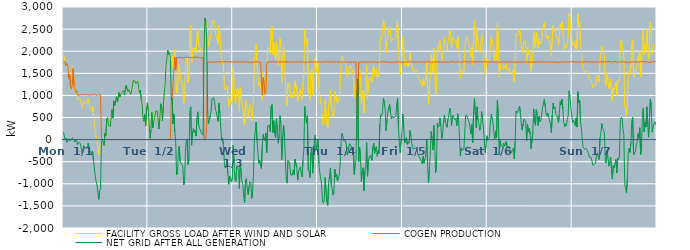
| Category | FACILITY GROSS LOAD AFTER WIND AND SOLAR | COGEN PRODUCTION | NET GRID AFTER ALL GENERATION |
|---|---|---|---|
|  Mon  1/1 | 1920 | 1759 | 161 |
|  Mon  1/1 | 1850 | 1761 | 89 |
|  Mon  1/1 | 1764 | 1761 | 3 |
|  Mon  1/1 | 1705 | 1670 | 35 |
|  Mon  1/1 | 1656 | 1719 | -63 |
|  Mon  1/1 | 1601 | 1651 | -50 |
|  Mon  1/1 | 1404 | 1382 | 22 |
|  Mon  1/1 | 1454 | 1482 | -28 |
|  Mon  1/1 | 1142 | 1192 | -50 |
|  Mon  1/1 | 1148 | 1142 | 6 |
|  Mon  1/1 | 1280 | 1239 | 41 |
|  Mon  1/1 | 1650 | 1610 | 40 |
|  Mon  1/1 | 1210 | 1207 | 3 |
|  Mon  1/1 | 1090 | 1144 | -54 |
|  Mon  1/1 | 1079 | 1065 | 14 |
|  Mon  1/1 | 1090 | 1102 | -12 |
|  Mon  1/1 | 893 | 1006 | -113 |
|  Mon  1/1 | 885 | 1011 | -126 |
|  Mon  1/1 | 942 | 1004 | -62 |
|  Mon  1/1 | 911 | 1004 | -93 |
|  Mon  1/1 | 848 | 1017 | -169 |
|  Mon  1/1 | 722 | 1019 | -297 |
|  Mon  1/1 | 771 | 1011 | -240 |
|  Mon  1/1 | 876 | 1012 | -136 |
|  Mon  1/1 | 874 | 1012 | -138 |
|  Mon  1/1 | 808 | 1005 | -197 |
|  Mon  1/1 | 809 | 1016 | -207 |
|  Mon  1/1 | 825 | 1019 | -194 |
|  Mon  1/1 | 928 | 1007 | -79 |
|  Mon  1/1 | 835 | 1017 | -182 |
|  Mon  1/1 | 722 | 1014 | -292 |
|  Mon  1/1 | 739 | 1004 | -265 |
|  Mon  1/1 | 667 | 1005 | -338 |
|  Mon  1/1 | 746 | 1012 | -266 |
|  Mon  1/1 | 543 | 1015 | -472 |
|  Mon  1/1 | 527 | 1000 | -473 |
|  Mon  1/1 | 190 | 1014 | -824 |
|  Mon  1/1 | 55 | 1006 | -951 |
|  Mon  1/1 | -31 | 1000 | -1031 |
|  Mon  1/1 | -34 | 1008 | -1042 |
|  Mon  1/1 | -337 | 1015 | -1352 |
|  Mon  1/1 | -141 | 1018 | -1159 |
|  Mon  1/1 | -101 | 1015 | -1116 |
|  Mon  1/1 | -77 | 0 | -77 |
|  Mon  1/1 | 2 | 0 | 2 |
|  Mon  1/1 | 8 | 0 | 8 |
|  Mon  1/1 | -132 | 0 | -132 |
|  Mon  1/1 | 142 | 0 | 142 |
|  Mon  1/1 | 87 | 0 | 87 |
|  Mon  1/1 | 474 | 0 | 474 |
|  Mon  1/1 | 502 | 0 | 502 |
|  Mon  1/1 | 321 | 0 | 321 |
|  Mon  1/1 | 328 | 0 | 328 |
|  Mon  1/1 | 293 | 0 | 293 |
|  Mon  1/1 | 511 | 0 | 511 |
|  Mon  1/1 | 682 | 0 | 682 |
|  Mon  1/1 | 487 | 0 | 487 |
|  Mon  1/1 | 876 | 0 | 876 |
|  Mon  1/1 | 771 | 0 | 771 |
|  Mon  1/1 | 872 | 0 | 872 |
|  Mon  1/1 | 971 | 0 | 971 |
|  Mon  1/1 | 854 | 0 | 854 |
|  Mon  1/1 | 856 | 0 | 856 |
|  Mon  1/1 | 1066 | 0 | 1066 |
|  Mon  1/1 | 966 | 0 | 966 |
|  Mon  1/1 | 974 | 0 | 974 |
|  Mon  1/1 | 1064 | 0 | 1064 |
|  Mon  1/1 | 1073 | 0 | 1073 |
|  Mon  1/1 | 1115 | 0 | 1115 |
|  Mon  1/1 | 1007 | 0 | 1007 |
|  Mon  1/1 | 1029 | 0 | 1029 |
|  Mon  1/1 | 1224 | 0 | 1224 |
|  Mon  1/1 | 1139 | 0 | 1139 |
|  Mon  1/1 | 1089 | 0 | 1089 |
|  Mon  1/1 | 1135 | 0 | 1135 |
|  Mon  1/1 | 1115 | 0 | 1115 |
|  Mon  1/1 | 1025 | 0 | 1025 |
|  Mon  1/1 | 1078 | 0 | 1078 |
|  Mon  1/1 | 1213 | 0 | 1213 |
|  Mon  1/1 | 1345 | 0 | 1345 |
|  Mon  1/1 | 1341 | 0 | 1341 |
|  Mon  1/1 | 1322 | 0 | 1322 |
|  Mon  1/1 | 1270 | 0 | 1270 |
|  Mon  1/1 | 1283 | 0 | 1283 |
|  Mon  1/1 | 1324 | 0 | 1324 |
|  Mon  1/1 | 1210 | 0 | 1210 |
|  Mon  1/1 | 1052 | 0 | 1052 |
|  Mon  1/1 | 1119 | 0 | 1119 |
|  Mon  1/1 | 903 | 0 | 903 |
|  Mon  1/1 | 793 | 0 | 793 |
|  Mon  1/1 | 480 | 0 | 480 |
|  Mon  1/1 | 416 | 0 | 416 |
|  Mon  1/1 | 565 | 0 | 565 |
|  Mon  1/1 | 310 | 0 | 310 |
|  Mon  1/1 | 713 | 0 | 713 |
|  Mon  1/1 | 830 | 0 | 830 |
|  Tue  1/2 | 645 | 0 | 645 |
|  Tue  1/2 | 342 | 0 | 342 |
|  Tue  1/2 | 29 | 0 | 29 |
|  Tue  1/2 | 216 | 0 | 216 |
|  Tue  1/2 | 615 | 0 | 615 |
|  Tue  1/2 | 262 | 0 | 262 |
|  Tue  1/2 | 409 | 0 | 409 |
|  Tue  1/2 | 460 | 0 | 460 |
|  Tue  1/2 | 635 | 0 | 635 |
|  Tue  1/2 | 630 | 0 | 630 |
|  Tue  1/2 | 650 | 0 | 650 |
|  Tue  1/2 | 467 | 0 | 467 |
|  Tue  1/2 | 241 | 0 | 241 |
|  Tue  1/2 | 467 | 0 | 467 |
|  Tue  1/2 | 812 | 0 | 812 |
|  Tue  1/2 | 727 | 0 | 727 |
|  Tue  1/2 | 421 | 0 | 421 |
|  Tue  1/2 | 762 | 0 | 762 |
|  Tue  1/2 | 1046 | 0 | 1046 |
|  Tue  1/2 | 1230 | 0 | 1230 |
|  Tue  1/2 | 1667 | 0 | 1667 |
|  Tue  1/2 | 1841 | 0 | 1841 |
|  Tue  1/2 | 2019 | 0 | 2019 |
|  Tue  1/2 | 1928 | 0 | 1928 |
|  Tue  1/2 | 1971 | 0 | 1971 |
|  Tue  1/2 | 1842 | 0 | 1842 |
|  Tue  1/2 | 1760 | 863 | 897 |
|  Tue  1/2 | 1887 | 946 | 941 |
|  Tue  1/2 | 1620 | 1265 | 355 |
|  Tue  1/2 | 1829 | 1255 | 574 |
|  Tue  1/2 | 2039 | 1868 | 171 |
|  Tue  1/2 | 1505 | 1568 | -63 |
|  Tue  1/2 | 1051 | 1851 | -800 |
|  Tue  1/2 | 1082 | 1856 | -774 |
|  Tue  1/2 | 1595 | 1862 | -267 |
|  Tue  1/2 | 1708 | 1859 | -151 |
|  Tue  1/2 | 1363 | 1854 | -491 |
|  Tue  1/2 | 1319 | 1851 | -532 |
|  Tue  1/2 | 1301 | 1855 | -554 |
|  Tue  1/2 | 1264 | 1857 | -593 |
|  Tue  1/2 | 824 | 1849 | -1025 |
|  Tue  1/2 | 877 | 1853 | -976 |
|  Tue  1/2 | 1589 | 1866 | -277 |
|  Tue  1/2 | 1832 | 1864 | -32 |
|  Tue  1/2 | 1871 | 1861 | 10 |
|  Tue  1/2 | 1289 | 1854 | -565 |
|  Tue  1/2 | 1412 | 1863 | -451 |
|  Tue  1/2 | 2508 | 1864 | 644 |
|  Tue  1/2 | 2594 | 1853 | 741 |
|  Tue  1/2 | 1730 | 1855 | -125 |
|  Tue  1/2 | 2026 | 1858 | 168 |
|  Tue  1/2 | 2100 | 1854 | 246 |
|  Tue  1/2 | 2021 | 1862 | 159 |
|  Tue  1/2 | 2055 | 1845 | 210 |
|  Tue  1/2 | 1947 | 1867 | 80 |
|  Tue  1/2 | 2328 | 1849 | 479 |
|  Tue  1/2 | 2492 | 1863 | 629 |
|  Tue  1/2 | 2177 | 1864 | 313 |
|  Tue  1/2 | 2109 | 1855 | 254 |
|  Tue  1/2 | 2093 | 1849 | 244 |
|  Tue  1/2 | 2002 | 1846 | 156 |
|  Tue  1/2 | 1984 | 1857 | 127 |
|  Tue  1/2 | 1956 | 1859 | 97 |
|  Tue  1/2 | 2005 | 0 | 2005 |
|  Tue  1/2 | 2753 | 0 | 2753 |
|  Tue  1/2 | 2650 | 0 | 2650 |
|  Tue  1/2 | 2626 | 319 | 2307 |
|  Tue  1/2 | 2437 | 1751 | 686 |
|  Tue  1/2 | 2110 | 1749 | 361 |
|  Tue  1/2 | 2115 | 1749 | 366 |
|  Tue  1/2 | 2292 | 1760 | 532 |
|  Tue  1/2 | 2382 | 1753 | 629 |
|  Tue  1/2 | 2679 | 1764 | 915 |
|  Tue  1/2 | 2650 | 1756 | 894 |
|  Tue  1/2 | 2703 | 1750 | 953 |
|  Tue  1/2 | 2606 | 1751 | 855 |
|  Tue  1/2 | 2419 | 1761 | 658 |
|  Tue  1/2 | 2398 | 1766 | 632 |
|  Tue  1/2 | 2257 | 1758 | 499 |
|  Tue  1/2 | 2170 | 1758 | 412 |
|  Tue  1/2 | 2576 | 1755 | 821 |
|  Tue  1/2 | 2349 | 1761 | 588 |
|  Tue  1/2 | 2019 | 1756 | 263 |
|  Tue  1/2 | 1736 | 1757 | -21 |
|  Tue  1/2 | 1797 | 1760 | 37 |
|  Tue  1/2 | 1651 | 1759 | -108 |
|  Tue  1/2 | 1235 | 1748 | -513 |
|  Tue  1/2 | 1122 | 1764 | -642 |
|  Tue  1/2 | 1149 | 1764 | -615 |
|  Tue  1/2 | 1207 | 1760 | -553 |
|  Tue  1/2 | 999 | 1760 | -761 |
|  Tue  1/2 | 744 | 1756 | -1012 |
|  Tue  1/2 | 927 | 1750 | -823 |
|  Tue  1/2 | 884 | 1761 | -877 |
|  Tue  1/2 | 804 | 1764 | -960 |
|  Tue  1/2 | 882 | 1758 | -876 |
|  Wed  1/3 | 1624 | 1755 | -131 |
|  Wed  1/3 | 1220 | 1760 | -540 |
|  Wed  1/3 | 858 | 1755 | -897 |
|  Wed  1/3 | 820 | 1765 | -945 |
|  Wed  1/3 | 1128 | 1751 | -623 |
|  Wed  1/3 | 1152 | 1754 | -602 |
|  Wed  1/3 | 1087 | 1757 | -670 |
|  Wed  1/3 | 651 | 1755 | -1104 |
|  Wed  1/3 | 1178 | 1757 | -579 |
|  Wed  1/3 | 1051 | 1761 | -710 |
|  Wed  1/3 | 813 | 1759 | -946 |
|  Wed  1/3 | 733 | 1755 | -1022 |
|  Wed  1/3 | 441 | 1756 | -1315 |
|  Wed  1/3 | 334 | 1757 | -1423 |
|  Wed  1/3 | 848 | 1764 | -916 |
|  Wed  1/3 | 884 | 1761 | -877 |
|  Wed  1/3 | 641 | 1748 | -1107 |
|  Wed  1/3 | 509 | 1761 | -1252 |
|  Wed  1/3 | 697 | 1758 | -1061 |
|  Wed  1/3 | 792 | 1744 | -952 |
|  Wed  1/3 | 764 | 1751 | -987 |
|  Wed  1/3 | 417 | 1747 | -1330 |
|  Wed  1/3 | 593 | 1756 | -1163 |
|  Wed  1/3 | 978 | 1757 | -779 |
|  Wed  1/3 | 1751 | 1758 | -7 |
|  Wed  1/3 | 1950 | 1758 | 192 |
|  Wed  1/3 | 2158 | 1762 | 396 |
|  Wed  1/3 | 1738 | 1765 | -27 |
|  Wed  1/3 | 1722 | 1761 | -39 |
|  Wed  1/3 | 1218 | 1751 | -533 |
|  Wed  1/3 | 1291 | 1756 | -465 |
|  Wed  1/3 | 1156 | 1752 | -596 |
|  Wed  1/3 | 1105 | 1759 | -654 |
|  Wed  1/3 | 890 | 1014 | -124 |
|  Wed  1/3 | 1525 | 1405 | 120 |
|  Wed  1/3 | 1303 | 1296 | 7 |
|  Wed  1/3 | 1006 | 1034 | -28 |
|  Wed  1/3 | 1237 | 1091 | 146 |
|  Wed  1/3 | 1415 | 1709 | -294 |
|  Wed  1/3 | 2069 | 1761 | 308 |
|  Wed  1/3 | 2073 | 1762 | 311 |
|  Wed  1/3 | 2083 | 1755 | 328 |
|  Wed  1/3 | 1948 | 1768 | 180 |
|  Wed  1/3 | 2507 | 1760 | 747 |
|  Wed  1/3 | 2555 | 1761 | 794 |
|  Wed  1/3 | 1926 | 1762 | 164 |
|  Wed  1/3 | 2187 | 1759 | 428 |
|  Wed  1/3 | 1913 | 1766 | 147 |
|  Wed  1/3 | 1802 | 1758 | 44 |
|  Wed  1/3 | 2226 | 1751 | 475 |
|  Wed  1/3 | 1971 | 1753 | 218 |
|  Wed  1/3 | 1679 | 1759 | -80 |
|  Wed  1/3 | 1856 | 1760 | 96 |
|  Wed  1/3 | 2291 | 1751 | 540 |
|  Wed  1/3 | 2135 | 1758 | 377 |
|  Wed  1/3 | 1307 | 1761 | -454 |
|  Wed  1/3 | 1830 | 1759 | 71 |
|  Wed  1/3 | 2085 | 1755 | 330 |
|  Wed  1/3 | 1816 | 1755 | 61 |
|  Wed  1/3 | 1341 | 1764 | -423 |
|  Wed  1/3 | 869 | 1760 | -891 |
|  Wed  1/3 | 769 | 1755 | -986 |
|  Wed  1/3 | 1287 | 1757 | -470 |
|  Wed  1/3 | 1263 | 1760 | -497 |
|  Wed  1/3 | 1216 | 1753 | -537 |
|  Wed  1/3 | 957 | 1754 | -797 |
|  Wed  1/3 | 960 | 1755 | -795 |
|  Wed  1/3 | 949 | 1753 | -804 |
|  Wed  1/3 | 1068 | 1754 | -686 |
|  Wed  1/3 | 965 | 1758 | -793 |
|  Wed  1/3 | 1317 | 1762 | -445 |
|  Wed  1/3 | 1319 | 1759 | -440 |
|  Wed  1/3 | 1129 | 1766 | -637 |
|  Wed  1/3 | 846 | 1765 | -919 |
|  Wed  1/3 | 1035 | 1751 | -716 |
|  Wed  1/3 | 1059 | 1753 | -694 |
|  Wed  1/3 | 1136 | 1753 | -617 |
|  Wed  1/3 | 1012 | 1764 | -752 |
|  Wed  1/3 | 912 | 1757 | -845 |
|  Wed  1/3 | 1290 | 1757 | -467 |
|  Wed  1/3 | 1541 | 1764 | -223 |
|  Wed  1/3 | 2495 | 1747 | 748 |
|  Wed  1/3 | 2270 | 1766 | 504 |
|  Wed  1/3 | 2123 | 1751 | 372 |
|  Wed  1/3 | 2298 | 1758 | 540 |
|  Wed  1/3 | 1078 | 1758 | -680 |
|  Wed  1/3 | 1026 | 1756 | -730 |
|  Wed  1/3 | 906 | 1760 | -854 |
|  Wed  1/3 | 1474 | 1762 | -288 |
|  Wed  1/3 | 1580 | 1753 | -173 |
|  Wed  1/3 | 996 | 1755 | -759 |
|  Wed  1/3 | 1352 | 1757 | -405 |
|  Wed  1/3 | 1776 | 1764 | 12 |
|  Wed  1/3 | 1866 | 1763 | 103 |
|  Wed  1/3 | 1524 | 1757 | -233 |
|  Wed  1/3 | 1622 | 1751 | -129 |
|  Thu  1/4 | 1761 | 1757 | 4 |
|  Thu  1/4 | 1211 | 1760 | -549 |
|  Thu  1/4 | 1008 | 1755 | -747 |
|  Thu  1/4 | 987 | 1754 | -767 |
|  Thu  1/4 | 748 | 1758 | -1010 |
|  Thu  1/4 | 396 | 1759 | -1363 |
|  Thu  1/4 | 324 | 1765 | -1441 |
|  Thu  1/4 | 375 | 1759 | -1384 |
|  Thu  1/4 | 896 | 1752 | -856 |
|  Thu  1/4 | 918 | 1758 | -840 |
|  Thu  1/4 | 343 | 1755 | -1412 |
|  Thu  1/4 | 277 | 1768 | -1491 |
|  Thu  1/4 | 764 | 1760 | -996 |
|  Thu  1/4 | 941 | 1760 | -819 |
|  Thu  1/4 | 1120 | 1759 | -639 |
|  Thu  1/4 | 727 | 1753 | -1026 |
|  Thu  1/4 | 655 | 1762 | -1107 |
|  Thu  1/4 | 503 | 1758 | -1255 |
|  Thu  1/4 | 569 | 1750 | -1181 |
|  Thu  1/4 | 1095 | 1760 | -665 |
|  Thu  1/4 | 912 | 1755 | -843 |
|  Thu  1/4 | 974 | 1760 | -786 |
|  Thu  1/4 | 822 | 1762 | -940 |
|  Thu  1/4 | 896 | 1755 | -859 |
|  Thu  1/4 | 952 | 1758 | -806 |
|  Thu  1/4 | 1193 | 1759 | -566 |
|  Thu  1/4 | 1704 | 1758 | -54 |
|  Thu  1/4 | 1896 | 1753 | 143 |
|  Thu  1/4 | 1862 | 1761 | 101 |
|  Thu  1/4 | 1732 | 1763 | -31 |
|  Thu  1/4 | 1763 | 1752 | 11 |
|  Thu  1/4 | 1717 | 1752 | -35 |
|  Thu  1/4 | 1647 | 1757 | -110 |
|  Thu  1/4 | 1415 | 1759 | -344 |
|  Thu  1/4 | 1465 | 1761 | -296 |
|  Thu  1/4 | 1614 | 1757 | -143 |
|  Thu  1/4 | 1667 | 1758 | -91 |
|  Thu  1/4 | 1621 | 1745 | -124 |
|  Thu  1/4 | 1654 | 1761 | -107 |
|  Thu  1/4 | 1495 | 1760 | -265 |
|  Thu  1/4 | 1580 | 1759 | -179 |
|  Thu  1/4 | 959 | 1752 | -793 |
|  Thu  1/4 | 1213 | 1759 | -546 |
|  Thu  1/4 | 1282 | 1760 | -478 |
|  Thu  1/4 | 935 | 0 | 935 |
|  Thu  1/4 | 1371 | 0 | 1371 |
|  Thu  1/4 | 1252 | 1753 | -501 |
|  Thu  1/4 | 1597 | 1766 | -169 |
|  Thu  1/4 | 1390 | 1752 | -362 |
|  Thu  1/4 | 806 | 1750 | -944 |
|  Thu  1/4 | 1040 | 1756 | -716 |
|  Thu  1/4 | 1123 | 1759 | -636 |
|  Thu  1/4 | 603 | 1757 | -1154 |
|  Thu  1/4 | 1030 | 1755 | -725 |
|  Thu  1/4 | 1149 | 1753 | -604 |
|  Thu  1/4 | 1680 | 1750 | -70 |
|  Thu  1/4 | 928 | 1756 | -828 |
|  Thu  1/4 | 1271 | 1766 | -495 |
|  Thu  1/4 | 1377 | 1757 | -380 |
|  Thu  1/4 | 1409 | 1760 | -351 |
|  Thu  1/4 | 1341 | 1756 | -415 |
|  Thu  1/4 | 1286 | 1758 | -472 |
|  Thu  1/4 | 1598 | 1762 | -164 |
|  Thu  1/4 | 1674 | 1754 | -80 |
|  Thu  1/4 | 1445 | 1760 | -315 |
|  Thu  1/4 | 1550 | 1745 | -195 |
|  Thu  1/4 | 1589 | 1749 | -160 |
|  Thu  1/4 | 1384 | 1762 | -378 |
|  Thu  1/4 | 1503 | 1756 | -253 |
|  Thu  1/4 | 1432 | 1749 | -317 |
|  Thu  1/4 | 2105 | 1754 | 351 |
|  Thu  1/4 | 2320 | 1754 | 566 |
|  Thu  1/4 | 2295 | 1765 | 530 |
|  Thu  1/4 | 2393 | 1754 | 639 |
|  Thu  1/4 | 2699 | 1764 | 935 |
|  Thu  1/4 | 2604 | 1764 | 840 |
|  Thu  1/4 | 2420 | 1759 | 661 |
|  Thu  1/4 | 1956 | 1751 | 205 |
|  Thu  1/4 | 2217 | 1754 | 463 |
|  Thu  1/4 | 2206 | 1762 | 444 |
|  Thu  1/4 | 2487 | 1754 | 733 |
|  Thu  1/4 | 2552 | 1756 | 796 |
|  Thu  1/4 | 2361 | 1748 | 613 |
|  Thu  1/4 | 2218 | 1753 | 465 |
|  Thu  1/4 | 2279 | 1753 | 526 |
|  Thu  1/4 | 2256 | 1758 | 498 |
|  Thu  1/4 | 2245 | 1753 | 492 |
|  Thu  1/4 | 2263 | 1756 | 507 |
|  Thu  1/4 | 2300 | 1753 | 547 |
|  Thu  1/4 | 2557 | 1755 | 802 |
|  Thu  1/4 | 2689 | 1754 | 935 |
|  Thu  1/4 | 2027 | 1752 | 275 |
|  Thu  1/4 | 1693 | 1761 | -68 |
|  Thu  1/4 | 1462 | 1761 | -299 |
|  Thu  1/4 | 1743 | 1751 | -8 |
|  Thu  1/4 | 1933 | 1754 | 179 |
|  Fri  1/5 | 2328 | 1749 | 579 |
|  Fri  1/5 | 2051 | 1767 | 284 |
|  Fri  1/5 | 1677 | 1754 | -77 |
|  Fri  1/5 | 1656 | 1755 | -99 |
|  Fri  1/5 | 1793 | 1752 | 41 |
|  Fri  1/5 | 1654 | 1761 | -107 |
|  Fri  1/5 | 1719 | 1769 | -50 |
|  Fri  1/5 | 1663 | 1749 | -86 |
|  Fri  1/5 | 1965 | 1758 | 207 |
|  Fri  1/5 | 1839 | 1755 | 84 |
|  Fri  1/5 | 1675 | 1761 | -86 |
|  Fri  1/5 | 1668 | 1756 | -88 |
|  Fri  1/5 | 1534 | 1757 | -223 |
|  Fri  1/5 | 1537 | 1761 | -224 |
|  Fri  1/5 | 1565 | 1751 | -186 |
|  Fri  1/5 | 1581 | 1750 | -169 |
|  Fri  1/5 | 1556 | 1753 | -197 |
|  Fri  1/5 | 1423 | 1755 | -332 |
|  Fri  1/5 | 1436 | 1761 | -325 |
|  Fri  1/5 | 1353 | 1760 | -407 |
|  Fri  1/5 | 1289 | 1751 | -462 |
|  Fri  1/5 | 1256 | 1753 | -497 |
|  Fri  1/5 | 1217 | 1762 | -545 |
|  Fri  1/5 | 1369 | 1748 | -379 |
|  Fri  1/5 | 1223 | 1756 | -533 |
|  Fri  1/5 | 1310 | 1753 | -443 |
|  Fri  1/5 | 1441 | 1752 | -311 |
|  Fri  1/5 | 1761 | 1758 | 3 |
|  Fri  1/5 | 1200 | 1764 | -564 |
|  Fri  1/5 | 791 | 1762 | -971 |
|  Fri  1/5 | 1093 | 1763 | -670 |
|  Fri  1/5 | 1426 | 1753 | -327 |
|  Fri  1/5 | 1935 | 1750 | 185 |
|  Fri  1/5 | 1771 | 1770 | 1 |
|  Fri  1/5 | 1520 | 1754 | -234 |
|  Fri  1/5 | 2069 | 1751 | 318 |
|  Fri  1/5 | 1629 | 1756 | -127 |
|  Fri  1/5 | 1007 | 1755 | -748 |
|  Fri  1/5 | 1168 | 1766 | -598 |
|  Fri  1/5 | 2128 | 1755 | 373 |
|  Fri  1/5 | 2038 | 1758 | 280 |
|  Fri  1/5 | 2061 | 1753 | 308 |
|  Fri  1/5 | 2243 | 1750 | 493 |
|  Fri  1/5 | 2053 | 1751 | 302 |
|  Fri  1/5 | 1785 | 1757 | 28 |
|  Fri  1/5 | 1890 | 1763 | 127 |
|  Fri  1/5 | 2163 | 1758 | 405 |
|  Fri  1/5 | 2308 | 1750 | 558 |
|  Fri  1/5 | 2141 | 1754 | 387 |
|  Fri  1/5 | 2113 | 1760 | 353 |
|  Fri  1/5 | 2029 | 1751 | 278 |
|  Fri  1/5 | 2221 | 1749 | 472 |
|  Fri  1/5 | 2298 | 1752 | 546 |
|  Fri  1/5 | 2478 | 1766 | 712 |
|  Fri  1/5 | 2389 | 1762 | 627 |
|  Fri  1/5 | 2076 | 1763 | 313 |
|  Fri  1/5 | 2289 | 1767 | 522 |
|  Fri  1/5 | 2313 | 1758 | 555 |
|  Fri  1/5 | 2245 | 1755 | 490 |
|  Fri  1/5 | 2209 | 1759 | 450 |
|  Fri  1/5 | 2235 | 1752 | 483 |
|  Fri  1/5 | 2068 | 1755 | 313 |
|  Fri  1/5 | 2350 | 1764 | 586 |
|  Fri  1/5 | 2207 | 1765 | 442 |
|  Fri  1/5 | 1840 | 1760 | 80 |
|  Fri  1/5 | 1396 | 1765 | -369 |
|  Fri  1/5 | 1562 | 1747 | -185 |
|  Fri  1/5 | 1516 | 1754 | -238 |
|  Fri  1/5 | 1534 | 1767 | -233 |
|  Fri  1/5 | 1536 | 1755 | -219 |
|  Fri  1/5 | 1914 | 1766 | 148 |
|  Fri  1/5 | 2300 | 1763 | 537 |
|  Fri  1/5 | 2321 | 1759 | 562 |
|  Fri  1/5 | 2332 | 1764 | 568 |
|  Fri  1/5 | 2198 | 1752 | 446 |
|  Fri  1/5 | 2148 | 1752 | 396 |
|  Fri  1/5 | 2025 | 1766 | 259 |
|  Fri  1/5 | 1881 | 1754 | 127 |
|  Fri  1/5 | 2097 | 1756 | 341 |
|  Fri  1/5 | 1697 | 1763 | -66 |
|  Fri  1/5 | 2390 | 1762 | 628 |
|  Fri  1/5 | 2685 | 1754 | 931 |
|  Fri  1/5 | 2306 | 1753 | 553 |
|  Fri  1/5 | 2022 | 1756 | 266 |
|  Fri  1/5 | 2508 | 1768 | 740 |
|  Fri  1/5 | 2196 | 1759 | 437 |
|  Fri  1/5 | 2111 | 1757 | 354 |
|  Fri  1/5 | 1967 | 1755 | 212 |
|  Fri  1/5 | 2021 | 1764 | 257 |
|  Fri  1/5 | 2401 | 1767 | 634 |
|  Fri  1/5 | 2250 | 1756 | 494 |
|  Fri  1/5 | 2038 | 1752 | 286 |
|  Fri  1/5 | 1791 | 1765 | 26 |
|  Fri  1/5 | 1462 | 1754 | -292 |
|  Fri  1/5 | 1614 | 1752 | -138 |
|  Fri  1/5 | 1850 | 1763 | 87 |
|  Sat  1/6 | 1745 | 1762 | -17 |
|  Sat  1/6 | 1774 | 1750 | 24 |
|  Sat  1/6 | 1823 | 1757 | 66 |
|  Sat  1/6 | 2128 | 1757 | 371 |
|  Sat  1/6 | 2338 | 1760 | 578 |
|  Sat  1/6 | 2231 | 1745 | 486 |
|  Sat  1/6 | 2119 | 1751 | 368 |
|  Sat  1/6 | 1892 | 1760 | 132 |
|  Sat  1/6 | 1780 | 1758 | 22 |
|  Sat  1/6 | 1960 | 1763 | 197 |
|  Sat  1/6 | 1805 | 1758 | 47 |
|  Sat  1/6 | 2655 | 1759 | 896 |
|  Sat  1/6 | 2182 | 1749 | 433 |
|  Sat  1/6 | 1420 | 1755 | -335 |
|  Sat  1/6 | 1727 | 1748 | -21 |
|  Sat  1/6 | 1638 | 1760 | -122 |
|  Sat  1/6 | 1611 | 1759 | -148 |
|  Sat  1/6 | 1576 | 1756 | -180 |
|  Sat  1/6 | 1688 | 1766 | -78 |
|  Sat  1/6 | 1609 | 1758 | -149 |
|  Sat  1/6 | 1639 | 1755 | -116 |
|  Sat  1/6 | 1715 | 1758 | -43 |
|  Sat  1/6 | 1564 | 1757 | -193 |
|  Sat  1/6 | 1548 | 1763 | -215 |
|  Sat  1/6 | 1613 | 1758 | -145 |
|  Sat  1/6 | 1530 | 1758 | -228 |
|  Sat  1/6 | 1531 | 1756 | -225 |
|  Sat  1/6 | 1461 | 1759 | -298 |
|  Sat  1/6 | 1543 | 1762 | -219 |
|  Sat  1/6 | 1567 | 1758 | -191 |
|  Sat  1/6 | 1306 | 1744 | -438 |
|  Sat  1/6 | 1716 | 1760 | -44 |
|  Sat  1/6 | 2399 | 1758 | 641 |
|  Sat  1/6 | 2355 | 1756 | 599 |
|  Sat  1/6 | 2408 | 1755 | 653 |
|  Sat  1/6 | 2462 | 1758 | 704 |
|  Sat  1/6 | 2510 | 1757 | 753 |
|  Sat  1/6 | 2335 | 1750 | 585 |
|  Sat  1/6 | 2114 | 1756 | 358 |
|  Sat  1/6 | 1968 | 1755 | 213 |
|  Sat  1/6 | 1980 | 1762 | 218 |
|  Sat  1/6 | 2207 | 1749 | 458 |
|  Sat  1/6 | 2237 | 1757 | 480 |
|  Sat  1/6 | 2167 | 1748 | 419 |
|  Sat  1/6 | 1727 | 1755 | -28 |
|  Sat  1/6 | 2096 | 1752 | 344 |
|  Sat  1/6 | 1934 | 1757 | 177 |
|  Sat  1/6 | 2011 | 1759 | 252 |
|  Sat  1/6 | 1875 | 1753 | 122 |
|  Sat  1/6 | 1545 | 1754 | -209 |
|  Sat  1/6 | 1549 | 1756 | -207 |
|  Sat  1/6 | 1912 | 1749 | 163 |
|  Sat  1/6 | 2448 | 1753 | 695 |
|  Sat  1/6 | 2158 | 1761 | 397 |
|  Sat  1/6 | 2081 | 1756 | 325 |
|  Sat  1/6 | 2429 | 1751 | 678 |
|  Sat  1/6 | 2312 | 1761 | 551 |
|  Sat  1/6 | 2074 | 1755 | 319 |
|  Sat  1/6 | 2278 | 1753 | 525 |
|  Sat  1/6 | 2157 | 1755 | 402 |
|  Sat  1/6 | 2201 | 1762 | 439 |
|  Sat  1/6 | 2176 | 1753 | 423 |
|  Sat  1/6 | 2477 | 1762 | 715 |
|  Sat  1/6 | 2469 | 1759 | 710 |
|  Sat  1/6 | 2660 | 1755 | 905 |
|  Sat  1/6 | 2504 | 1748 | 756 |
|  Sat  1/6 | 2332 | 1758 | 574 |
|  Sat  1/6 | 2275 | 1749 | 526 |
|  Sat  1/6 | 2355 | 1756 | 599 |
|  Sat  1/6 | 2271 | 1758 | 513 |
|  Sat  1/6 | 2254 | 1755 | 499 |
|  Sat  1/6 | 2103 | 1759 | 344 |
|  Sat  1/6 | 1903 | 1749 | 154 |
|  Sat  1/6 | 2318 | 1763 | 555 |
|  Sat  1/6 | 2582 | 1757 | 825 |
|  Sat  1/6 | 2461 | 1766 | 695 |
|  Sat  1/6 | 2495 | 1755 | 740 |
|  Sat  1/6 | 2351 | 1761 | 590 |
|  Sat  1/6 | 2301 | 1748 | 553 |
|  Sat  1/6 | 2330 | 1762 | 568 |
|  Sat  1/6 | 2134 | 1750 | 384 |
|  Sat  1/6 | 2336 | 1754 | 582 |
|  Sat  1/6 | 2613 | 1749 | 864 |
|  Sat  1/6 | 2539 | 1752 | 787 |
|  Sat  1/6 | 2673 | 1762 | 911 |
|  Sat  1/6 | 2456 | 1763 | 693 |
|  Sat  1/6 | 2154 | 1752 | 402 |
|  Sat  1/6 | 2044 | 1753 | 291 |
|  Sat  1/6 | 2111 | 1757 | 354 |
|  Sat  1/6 | 2079 | 1763 | 316 |
|  Sat  1/6 | 2225 | 1756 | 469 |
|  Sat  1/6 | 2297 | 1762 | 535 |
|  Sat  1/6 | 2854 | 1751 | 1103 |
|  Sat  1/6 | 2746 | 1766 | 980 |
|  Sat  1/6 | 2498 | 1763 | 735 |
|  Sat  1/6 | 2495 | 1758 | 737 |
|  Sun  1/7 | 2144 | 1762 | 382 |
|  Sun  1/7 | 2198 | 1753 | 445 |
|  Sun  1/7 | 2196 | 1760 | 436 |
|  Sun  1/7 | 2067 | 1752 | 315 |
|  Sun  1/7 | 2247 | 1756 | 491 |
|  Sun  1/7 | 2046 | 1764 | 282 |
|  Sun  1/7 | 2846 | 1763 | 1083 |
|  Sun  1/7 | 2586 | 1757 | 829 |
|  Sun  1/7 | 2647 | 1752 | 895 |
|  Sun  1/7 | 2157 | 1755 | 402 |
|  Sun  1/7 | 2012 | 1757 | 255 |
|  Sun  1/7 | 1749 | 1756 | -7 |
|  Sun  1/7 | 1578 | 1761 | -183 |
|  Sun  1/7 | 1572 | 1761 | -189 |
|  Sun  1/7 | 1541 | 1763 | -222 |
|  Sun  1/7 | 1563 | 1761 | -198 |
|  Sun  1/7 | 1535 | 1762 | -227 |
|  Sun  1/7 | 1546 | 1757 | -211 |
|  Sun  1/7 | 1458 | 1762 | -304 |
|  Sun  1/7 | 1363 | 1761 | -398 |
|  Sun  1/7 | 1344 | 1752 | -408 |
|  Sun  1/7 | 1352 | 1755 | -403 |
|  Sun  1/7 | 1366 | 1763 | -397 |
|  Sun  1/7 | 1174 | 1753 | -579 |
|  Sun  1/7 | 1161 | 1754 | -593 |
|  Sun  1/7 | 1204 | 1758 | -554 |
|  Sun  1/7 | 1227 | 1757 | -530 |
|  Sun  1/7 | 1408 | 1759 | -351 |
|  Sun  1/7 | 1458 | 1762 | -304 |
|  Sun  1/7 | 1458 | 1752 | -294 |
|  Sun  1/7 | 1304 | 1753 | -449 |
|  Sun  1/7 | 1783 | 1753 | 30 |
|  Sun  1/7 | 1916 | 1761 | 155 |
|  Sun  1/7 | 2117 | 1754 | 363 |
|  Sun  1/7 | 2016 | 1759 | 257 |
|  Sun  1/7 | 1963 | 1756 | 207 |
|  Sun  1/7 | 1919 | 1763 | 156 |
|  Sun  1/7 | 1257 | 1763 | -506 |
|  Sun  1/7 | 1221 | 1753 | -532 |
|  Sun  1/7 | 1513 | 1760 | -247 |
|  Sun  1/7 | 1355 | 1766 | -411 |
|  Sun  1/7 | 1155 | 1757 | -602 |
|  Sun  1/7 | 1256 | 1768 | -512 |
|  Sun  1/7 | 1361 | 1755 | -394 |
|  Sun  1/7 | 1366 | 1749 | -383 |
|  Sun  1/7 | 874 | 1767 | -893 |
|  Sun  1/7 | 1172 | 1763 | -591 |
|  Sun  1/7 | 1124 | 1760 | -636 |
|  Sun  1/7 | 1139 | 1763 | -624 |
|  Sun  1/7 | 1303 | 1754 | -451 |
|  Sun  1/7 | 1001 | 1755 | -754 |
|  Sun  1/7 | 1342 | 1761 | -419 |
|  Sun  1/7 | 1303 | 1758 | -455 |
|  Sun  1/7 | 1380 | 1762 | -382 |
|  Sun  1/7 | 2167 | 1754 | 413 |
|  Sun  1/7 | 2267 | 1760 | 507 |
|  Sun  1/7 | 2249 | 1765 | 484 |
|  Sun  1/7 | 2010 | 1756 | 254 |
|  Sun  1/7 | 1862 | 1762 | 100 |
|  Sun  1/7 | 744 | 1759 | -1015 |
|  Sun  1/7 | 673 | 1751 | -1078 |
|  Sun  1/7 | 546 | 1756 | -1210 |
|  Sun  1/7 | 864 | 1751 | -887 |
|  Sun  1/7 | 1460 | 1760 | -300 |
|  Sun  1/7 | 1551 | 1749 | -198 |
|  Sun  1/7 | 1476 | 1763 | -287 |
|  Sun  1/7 | 1681 | 1752 | -71 |
|  Sun  1/7 | 2187 | 1760 | 427 |
|  Sun  1/7 | 2267 | 1764 | 503 |
|  Sun  1/7 | 1416 | 1764 | -348 |
|  Sun  1/7 | 1437 | 1755 | -318 |
|  Sun  1/7 | 1491 | 1761 | -270 |
|  Sun  1/7 | 1611 | 1751 | -140 |
|  Sun  1/7 | 1707 | 1760 | -53 |
|  Sun  1/7 | 1893 | 1763 | 130 |
|  Sun  1/7 | 1783 | 1754 | 29 |
|  Sun  1/7 | 2022 | 1755 | 267 |
|  Sun  1/7 | 1419 | 1757 | -338 |
|  Sun  1/7 | 1622 | 1767 | -145 |
|  Sun  1/7 | 2348 | 1771 | 577 |
|  Sun  1/7 | 2474 | 1767 | 707 |
|  Sun  1/7 | 1927 | 1751 | 176 |
|  Sun  1/7 | 2149 | 1758 | 391 |
|  Sun  1/7 | 2032 | 1749 | 283 |
|  Sun  1/7 | 2498 | 1757 | 741 |
|  Sun  1/7 | 2082 | 1746 | 336 |
|  Sun  1/7 | 1804 | 1749 | 55 |
|  Sun  1/7 | 1822 | 1757 | 65 |
|  Sun  1/7 | 2659 | 1750 | 909 |
|  Sun  1/7 | 2528 | 1756 | 772 |
|  Sun  1/7 | 1929 | 1762 | 167 |
|  Sun  1/7 | 2045 | 1757 | 288 |
|  Sun  1/7 | 2047 | 1766 | 281 |
|  Sun  1/7 | 2157 | 1753 | 404 |
|  Sun  1/7 | 2116 | 1760 | 356 |
|  Sun  1/7 | 2055 | 1749 | 306 |